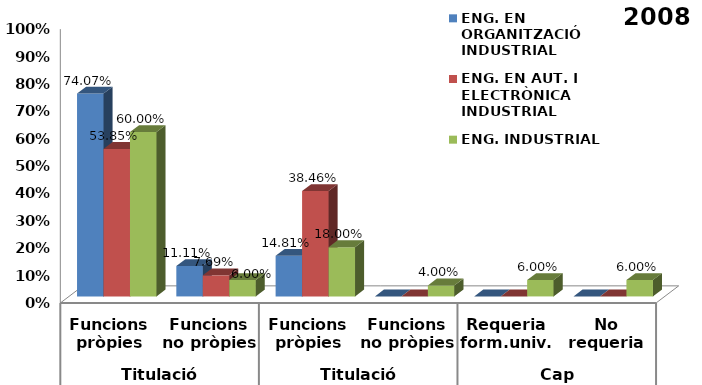
| Category | ENG. EN ORGANITZACIÓ INDUSTRIAL | ENG. EN AUT. I ELECTRÒNICA INDUSTRIAL | ENG. INDUSTRIAL |
|---|---|---|---|
| 0 | 0.741 | 0.538 | 0.6 |
| 1 | 0.111 | 0.077 | 0.06 |
| 2 | 0.148 | 0.385 | 0.18 |
| 3 | 0 | 0 | 0.04 |
| 4 | 0 | 0 | 0.06 |
| 5 | 0 | 0 | 0.06 |